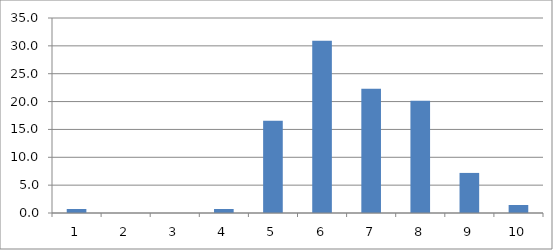
| Category | Series 0 |
|---|---|
| 0 | 0.719 |
| 1 | 0 |
| 2 | 0 |
| 3 | 0.719 |
| 4 | 16.547 |
| 5 | 30.935 |
| 6 | 22.302 |
| 7 | 20.144 |
| 8 | 7.194 |
| 9 | 1.439 |